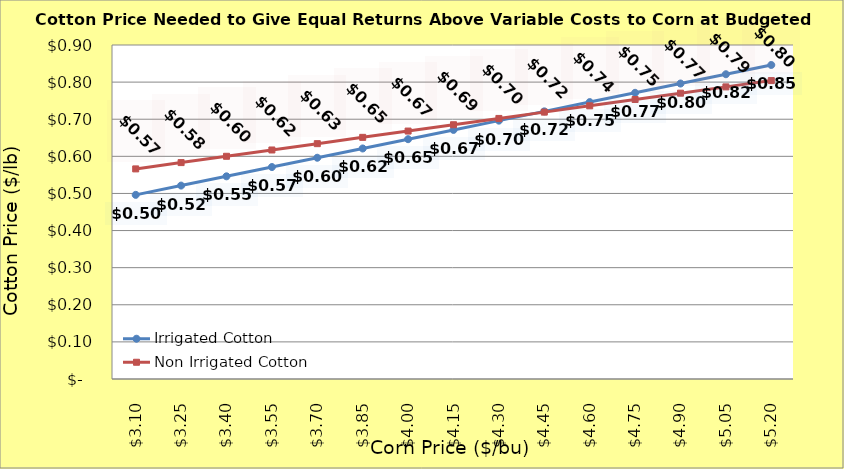
| Category | Irrigated Cotton | Non Irrigated Cotton |
|---|---|---|
| 3.1000000000000005 | 0.496 | 0.566 |
| 3.2500000000000004 | 0.521 | 0.583 |
| 3.4000000000000004 | 0.546 | 0.6 |
| 3.5500000000000003 | 0.571 | 0.617 |
| 3.7 | 0.596 | 0.634 |
| 3.85 | 0.621 | 0.651 |
| 4.0 | 0.646 | 0.668 |
| 4.15 | 0.671 | 0.685 |
| 4.300000000000001 | 0.696 | 0.702 |
| 4.450000000000001 | 0.721 | 0.719 |
| 4.600000000000001 | 0.746 | 0.736 |
| 4.750000000000002 | 0.771 | 0.753 |
| 4.900000000000002 | 0.796 | 0.77 |
| 5.0500000000000025 | 0.821 | 0.787 |
| 5.200000000000003 | 0.846 | 0.804 |